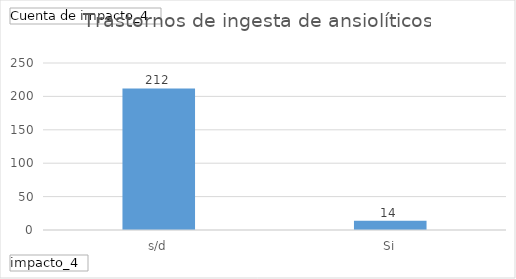
| Category | Total |
|---|---|
| s/d | 212 |
| Si | 14 |